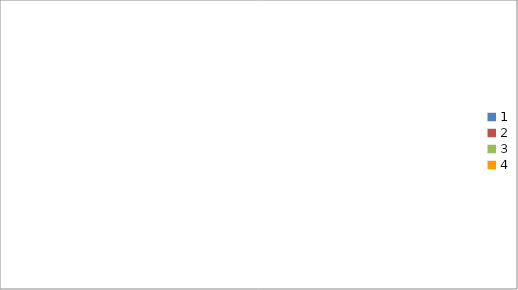
| Category | Series 0 |
|---|---|
| 0 | 890 |
| 1 | 870 |
| 2 | 2480 |
| 3 | 3170 |